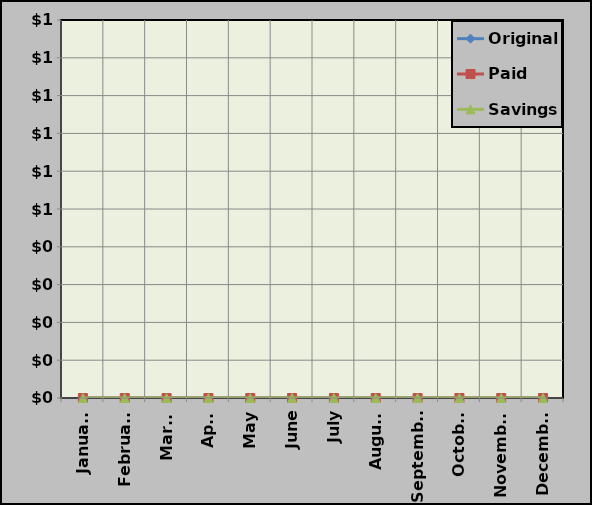
| Category | Original | Paid | Savings |
|---|---|---|---|
| January | 0 | 0 | 0 |
| February | 0 | 0 | 0 |
| March | 0 | 0 | 0 |
| April | 0 | 0 | 0 |
| May | 0 | 0 | 0 |
| June | 0 | 0 | 0 |
| July | 0 | 0 | 0 |
| August | 0 | 0 | 0 |
| September | 0 | 0 | 0 |
| October | 0 | 0 | 0 |
| November | 0 | 0 | 0 |
| December | 0 | 0 | 0 |